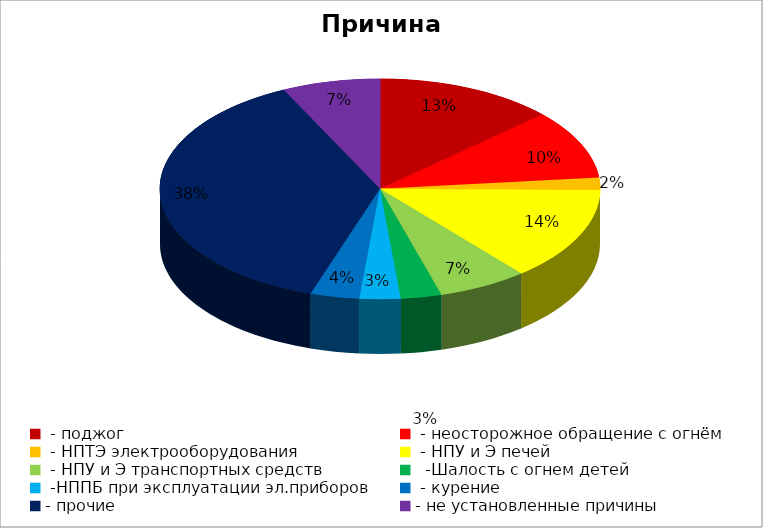
| Category | Причина пожара |
|---|---|
|  - поджог | 22 |
|  - неосторожное обращение с огнём | 17 |
|  - НПТЭ электрооборудования | 3 |
|  - НПУ и Э печей | 23 |
|  - НПУ и Э транспортных средств | 11 |
|   -Шалость с огнем детей | 5 |
|  -НППБ при эксплуатации эл.приборов | 5 |
|  - курение | 6 |
| - прочие | 63 |
| - не установленные причины | 12 |